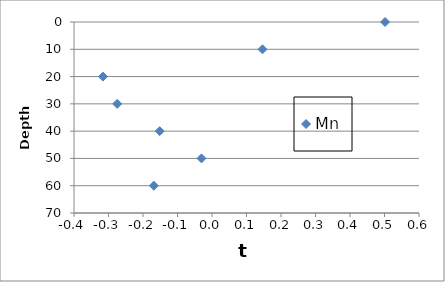
| Category | Mn |
|---|---|
| 0.501472724043502 | 0 |
| 0.146325361096379 | 10 |
| -0.316099686078544 | 20 |
| -0.274878297294238 | 30 |
| -0.151700572155118 | 40 |
| -0.0305149396058487 | 50 |
| -0.168577733546796 | 60 |